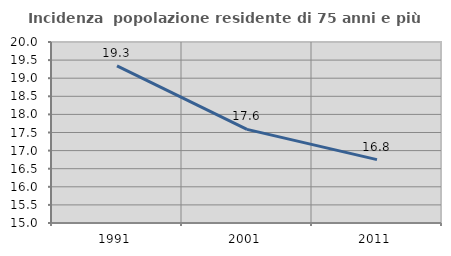
| Category | Incidenza  popolazione residente di 75 anni e più |
|---|---|
| 1991.0 | 19.339 |
| 2001.0 | 17.587 |
| 2011.0 | 16.751 |